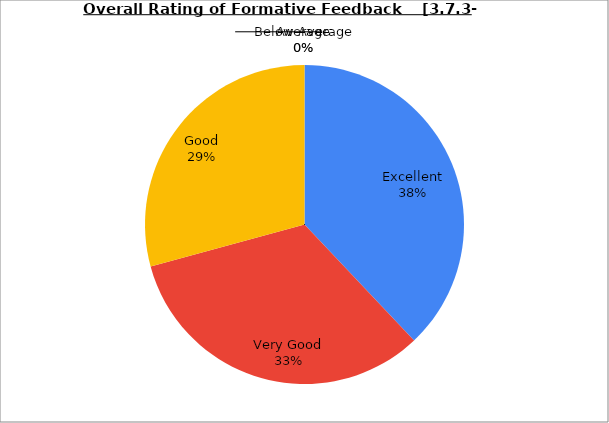
| Category | Series 0 |
|---|---|
| Excellent | 37.949 |
| Very Good | 32.821 |
| Good | 29.231 |
| Average | 0 |
| Below Average | 0 |